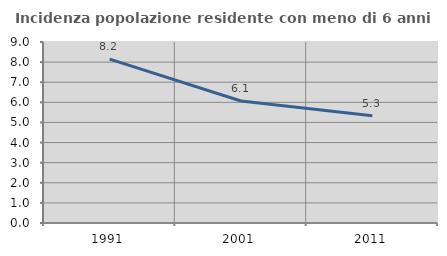
| Category | Incidenza popolazione residente con meno di 6 anni |
|---|---|
| 1991.0 | 8.151 |
| 2001.0 | 6.065 |
| 2011.0 | 5.33 |